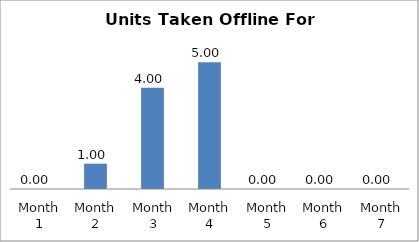
| Category | Series 0 |
|---|---|
| 1.0 | 0 |
| 2.0 | 1 |
| 3.0 | 4 |
| 4.0 | 5 |
| 5.0 | 0 |
| 6.0 | 0 |
| 7.0 | 0 |